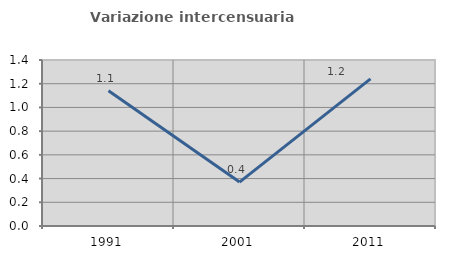
| Category | Variazione intercensuaria annua |
|---|---|
| 1991.0 | 1.141 |
| 2001.0 | 0.371 |
| 2011.0 | 1.241 |